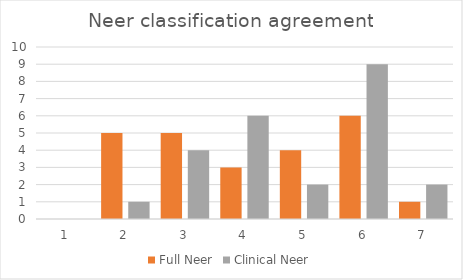
| Category | AO/OTA |
|---|---|
| 0 | 0 |
| 1 | 7 |
| 2 | 4 |
| 3 | 6 |
| 4 | 2 |
| 5 | 5 |
| 6 | 0 |